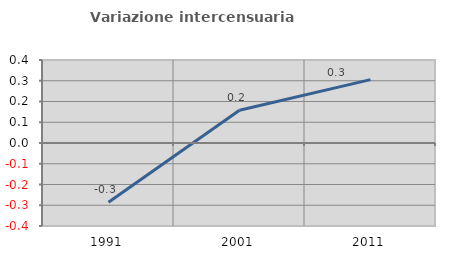
| Category | Variazione intercensuaria annua |
|---|---|
| 1991.0 | -0.286 |
| 2001.0 | 0.158 |
| 2011.0 | 0.306 |